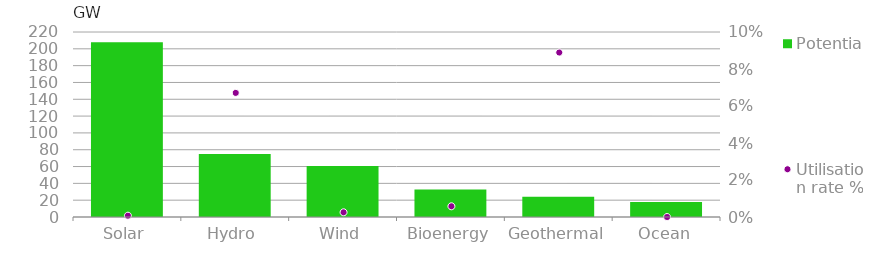
| Category | Potential |
|---|---|
| Solar | 207.8 |
| Hydro | 75 |
| Wind | 60.65 |
| Bioenergy | 32.654 |
| Geothermal | 23.966 |
| Ocean | 17.9 |